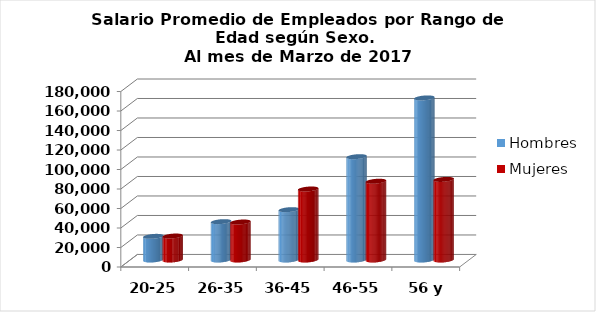
| Category | Hombres | Mujeres |
|---|---|---|
| 20-25 | 24249.231 | 24579.167 |
| 26-35 | 39355.68 | 38953.2 |
| 36-45 | 51647.88 | 72832.483 |
| 46-55 | 105991 | 80798.765 |
| 56 y más | 166271.909 | 82659.571 |